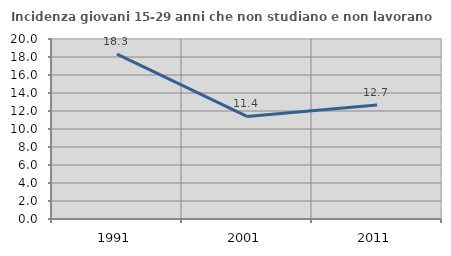
| Category | Incidenza giovani 15-29 anni che non studiano e non lavorano  |
|---|---|
| 1991.0 | 18.323 |
| 2001.0 | 11.399 |
| 2011.0 | 12.673 |